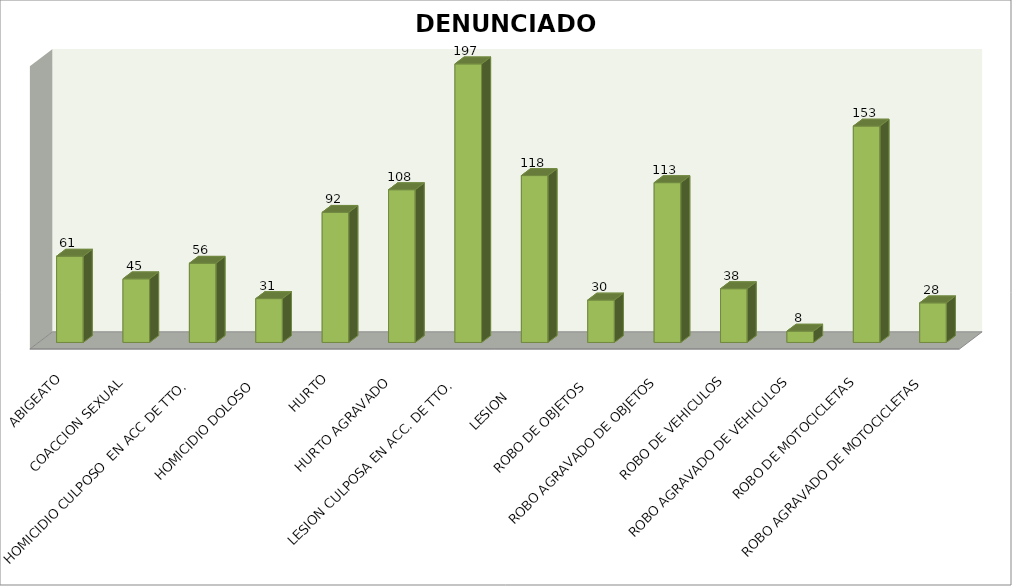
| Category | DENUNCIADOS |
|---|---|
| ABIGEATO | 61 |
| COACCION SEXUAL | 45 |
| HOMICIDIO CULPOSO  EN ACC DE TTO.  | 56 |
| HOMICIDIO DOLOSO  | 31 |
| HURTO | 92 |
| HURTO AGRAVADO | 108 |
| LESION CULPOSA EN ACC. DE TTO. | 197 |
| LESION      | 118 |
| ROBO DE OBJETOS  | 30 |
| ROBO AGRAVADO DE OBJETOS | 113 |
| ROBO DE VEHICULOS | 38 |
| ROBO AGRAVADO DE VEHICULOS | 8 |
| ROBO DE MOTOCICLETAS | 153 |
| ROBO AGRAVADO DE MOTOCICLETAS | 28 |